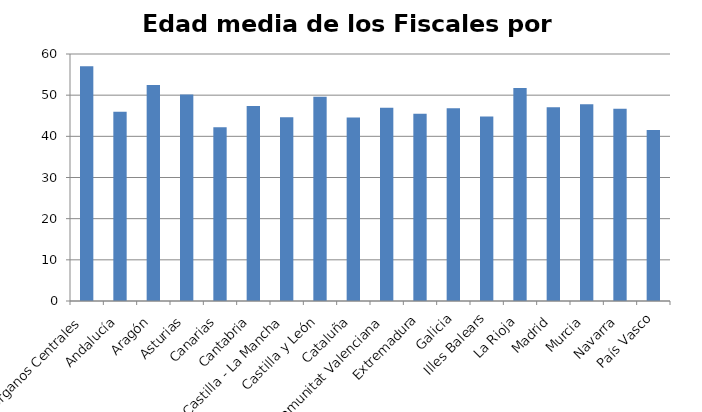
| Category | Edad Media |
|---|---|
| Órganos Centrales | 57.01 |
| Andalucía | 45.995 |
| Aragón | 52.46 |
| Asturias | 50.175 |
| Canarias | 42.195 |
| Cantabria | 47.365 |
| Castilla - La Mancha | 44.665 |
| Castilla y León | 49.61 |
| Cataluña | 44.585 |
| Comunitat Valenciana | 46.965 |
| Extremadura | 45.48 |
| Galicia | 46.8 |
| Illes Balears | 44.815 |
| La Rioja | 51.75 |
| Madrid | 47.09 |
| Murcia | 47.775 |
| Navarra | 46.715 |
| País Vasco | 41.55 |